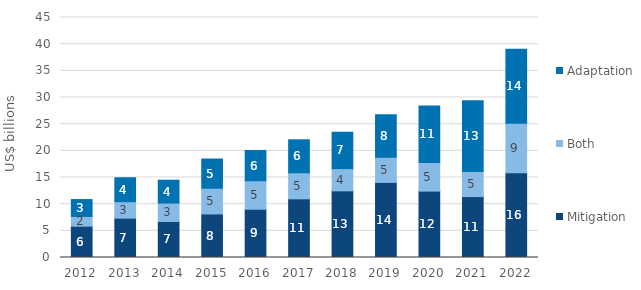
| Category | Mitigation | Both | Adaptation |
|---|---|---|---|
| 2012.0 | 5.871 | 1.828 | 3.163 |
| 2013.0 | 7.375 | 3.079 | 4.495 |
| 2014.0 | 6.76 | 3.448 | 4.288 |
| 2015.0 | 8.168 | 4.817 | 5.485 |
| 2016.0 | 9.042 | 5.347 | 5.666 |
| 2017.0 | 11.003 | 4.879 | 6.185 |
| 2018.0 | 12.502 | 4.161 | 6.825 |
| 2019.0 | 14.08 | 4.707 | 7.963 |
| 2020.0 | 12.45 | 5.371 | 10.584 |
| 2021.0 | 11.422 | 4.693 | 13.299 |
| 2022.0 | 15.872 | 9.306 | 13.882 |